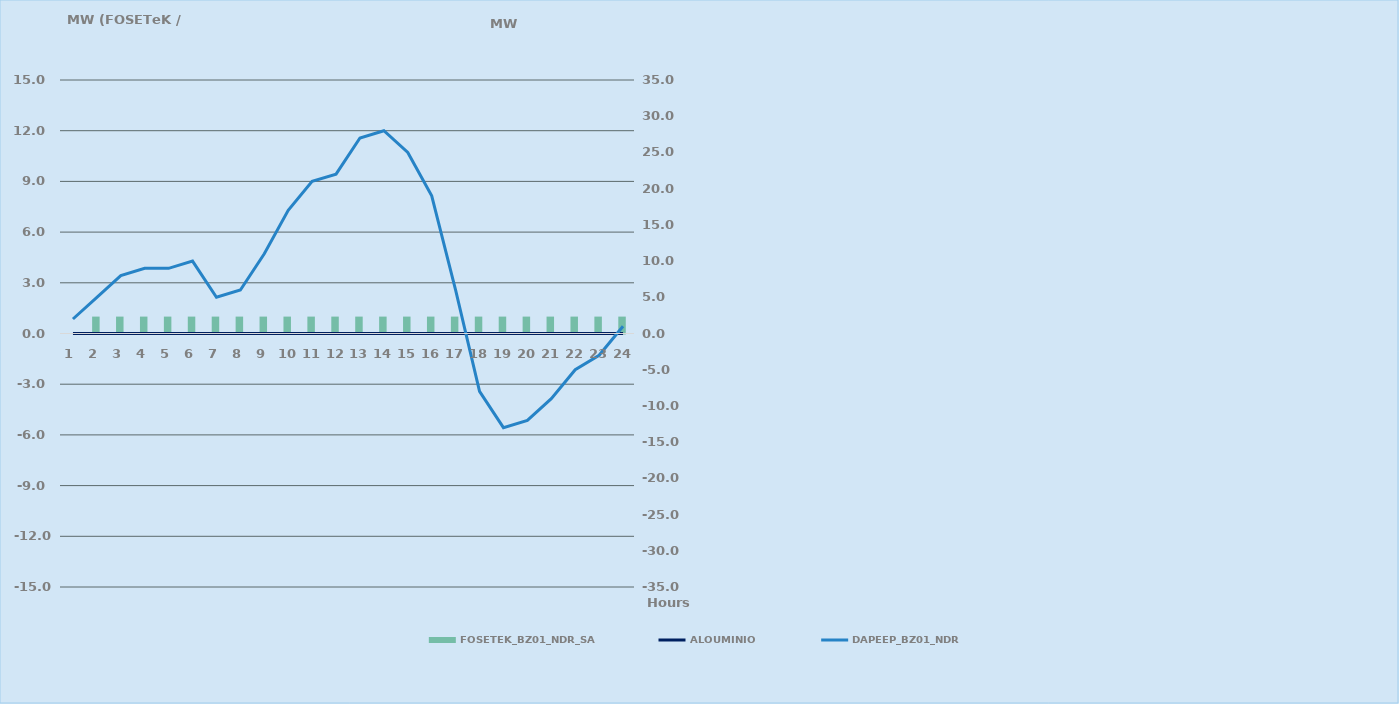
| Category | FOSETEK_BZ01_NDR_SA |
|---|---|
| 0 | 0 |
| 1 | 1 |
| 2 | 1 |
| 3 | 1 |
| 4 | 1 |
| 5 | 1 |
| 6 | 1 |
| 7 | 1 |
| 8 | 1 |
| 9 | 1 |
| 10 | 1 |
| 11 | 1 |
| 12 | 1 |
| 13 | 1 |
| 14 | 1 |
| 15 | 1 |
| 16 | 1 |
| 17 | 1 |
| 18 | 1 |
| 19 | 1 |
| 20 | 1 |
| 21 | 1 |
| 22 | 1 |
| 23 | 1 |